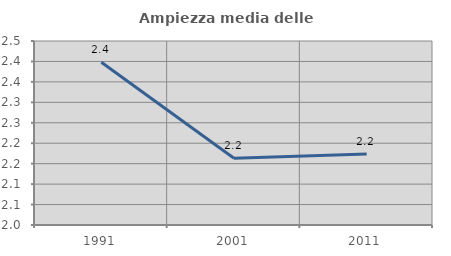
| Category | Ampiezza media delle famiglie |
|---|---|
| 1991.0 | 2.398 |
| 2001.0 | 2.163 |
| 2011.0 | 2.174 |